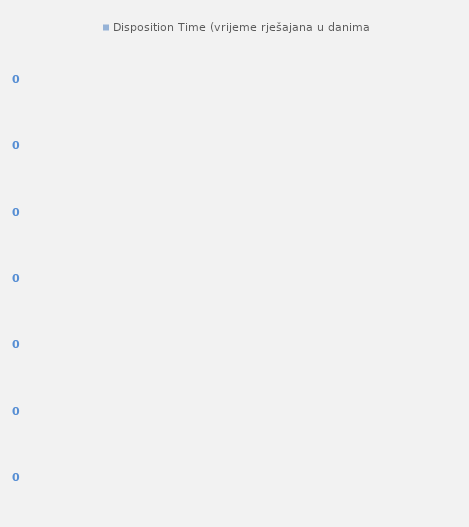
| Category | Disposition Time (vrijeme rješajana u danima) |
|---|---|
| Kazneni (Criminal) | 223.076 |
| Građanski (Civil) | 308.328 |
| Upravni (Administrative) | 236.969 |
| Ovršni (Enforcement) | 232.888 |
| Trgovački (Commercial) | 366.898 |
| Prekršajni (Misdemeanour) | 112.618 |
| Zemljišnoknjižni (Land Registry) | 29.762 |